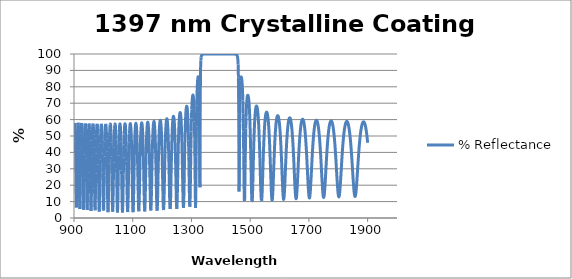
| Category | % Reflectance |
|---|---|
| 900.0 | 44.836 |
| 901.0 | 53.472 |
| 902.0 | 57.582 |
| 903.0 | 57.904 |
| 904.0 | 54.523 |
| 905.0 | 46.855 |
| 906.0 | 34.164 |
| 907.0 | 17.925 |
| 908.0 | 6.381 |
| 909.0 | 10.008 |
| 910.0 | 25.01 |
| 911.0 | 40.083 |
| 912.0 | 50.481 |
| 913.0 | 56.205 |
| 914.0 | 58.077 |
| 915.0 | 56.466 |
| 916.0 | 51.097 |
| 917.0 | 41.22 |
| 918.0 | 26.678 |
| 919.0 | 11.303 |
| 920.0 | 5.435 |
| 921.0 | 14.273 |
| 922.0 | 29.58 |
| 923.0 | 42.885 |
| 924.0 | 51.741 |
| 925.0 | 56.535 |
| 926.0 | 57.948 |
| 927.0 | 56.238 |
| 928.0 | 51.14 |
| 929.0 | 42.007 |
| 930.0 | 28.588 |
| 931.0 | 13.521 |
| 932.0 | 5.052 |
| 933.0 | 10.369 |
| 934.0 | 24.644 |
| 935.0 | 38.788 |
| 936.0 | 48.954 |
| 937.0 | 55.009 |
| 938.0 | 57.631 |
| 939.0 | 57.242 |
| 940.0 | 53.799 |
| 941.0 | 46.987 |
| 942.0 | 36.211 |
| 943.0 | 22.03 |
| 944.0 | 8.794 |
| 945.0 | 4.888 |
| 946.0 | 13.552 |
| 947.0 | 27.928 |
| 948.0 | 40.84 |
| 949.0 | 49.906 |
| 950.0 | 55.282 |
| 951.0 | 57.571 |
| 952.0 | 57.115 |
| 953.0 | 53.864 |
| 954.0 | 47.401 |
| 955.0 | 37.189 |
| 956.0 | 23.568 |
| 957.0 | 10.062 |
| 958.0 | 4.292 |
| 959.0 | 10.787 |
| 960.0 | 24.395 |
| 961.0 | 37.564 |
| 962.0 | 47.397 |
| 963.0 | 53.67 |
| 964.0 | 56.911 |
| 965.0 | 57.539 |
| 966.0 | 55.654 |
| 967.0 | 51.025 |
| 968.0 | 43.169 |
| 969.0 | 31.785 |
| 970.0 | 18.048 |
| 971.0 | 6.677 |
| 972.0 | 4.68 |
| 973.0 | 13.533 |
| 974.0 | 27.092 |
| 975.0 | 39.431 |
| 976.0 | 48.432 |
| 977.0 | 54.115 |
| 978.0 | 56.985 |
| 979.0 | 57.403 |
| 980.0 | 55.437 |
| 981.0 | 50.925 |
| 982.0 | 43.424 |
| 983.0 | 32.643 |
| 984.0 | 19.477 |
| 985.0 | 7.773 |
| 986.0 | 3.892 |
| 987.0 | 10.548 |
| 988.0 | 23.168 |
| 989.0 | 35.774 |
| 990.0 | 45.568 |
| 991.0 | 52.173 |
| 992.0 | 55.991 |
| 993.0 | 57.428 |
| 994.0 | 56.667 |
| 995.0 | 53.632 |
| 996.0 | 48.006 |
| 997.0 | 39.378 |
| 998.0 | 27.756 |
| 999.0 | 14.814 |
| 1000.0 | 5.239 |
| 1001.0 | 4.587 |
| 1002.0 | 13.137 |
| 1003.0 | 25.734 |
| 1004.0 | 37.508 |
| 1005.0 | 46.495 |
| 1006.0 | 52.55 |
| 1007.0 | 56.059 |
| 1008.0 | 57.376 |
| 1009.0 | 56.659 |
| 1010.0 | 53.84 |
| 1011.0 | 48.645 |
| 1012.0 | 40.7 |
| 1013.0 | 29.913 |
| 1014.0 | 17.422 |
| 1015.0 | 6.872 |
| 1016.0 | 3.569 |
| 1017.0 | 9.587 |
| 1018.0 | 21.205 |
| 1019.0 | 33.314 |
| 1020.0 | 43.187 |
| 1021.0 | 50.183 |
| 1022.0 | 54.641 |
| 1023.0 | 56.927 |
| 1024.0 | 57.276 |
| 1025.0 | 55.735 |
| 1026.0 | 52.161 |
| 1027.0 | 46.253 |
| 1028.0 | 37.701 |
| 1029.0 | 26.641 |
| 1030.0 | 14.612 |
| 1031.0 | 5.463 |
| 1032.0 | 3.825 |
| 1033.0 | 10.655 |
| 1034.0 | 22.109 |
| 1035.0 | 33.713 |
| 1036.0 | 43.177 |
| 1037.0 | 50.01 |
| 1038.0 | 54.439 |
| 1039.0 | 56.802 |
| 1040.0 | 57.33 |
| 1041.0 | 56.099 |
| 1042.0 | 53.013 |
| 1043.0 | 47.82 |
| 1044.0 | 40.223 |
| 1045.0 | 30.175 |
| 1046.0 | 18.576 |
| 1047.0 | 8.199 |
| 1048.0 | 3.358 |
| 1049.0 | 6.683 |
| 1050.0 | 16.272 |
| 1051.0 | 27.824 |
| 1052.0 | 38.21 |
| 1053.0 | 46.261 |
| 1054.0 | 51.914 |
| 1055.0 | 55.455 |
| 1056.0 | 57.168 |
| 1057.0 | 57.213 |
| 1058.0 | 55.602 |
| 1059.0 | 52.202 |
| 1060.0 | 46.765 |
| 1061.0 | 39.086 |
| 1062.0 | 29.162 |
| 1063.0 | 17.94 |
| 1064.0 | 8.046 |
| 1065.0 | 3.387 |
| 1066.0 | 6.341 |
| 1067.0 | 15.315 |
| 1068.0 | 26.446 |
| 1069.0 | 36.732 |
| 1070.0 | 44.921 |
| 1071.0 | 50.848 |
| 1072.0 | 54.747 |
| 1073.0 | 56.886 |
| 1074.0 | 57.447 |
| 1075.0 | 56.484 |
| 1076.0 | 53.926 |
| 1077.0 | 49.584 |
| 1078.0 | 43.207 |
| 1079.0 | 34.64 |
| 1080.0 | 24.225 |
| 1081.0 | 13.529 |
| 1082.0 | 5.528 |
| 1083.0 | 3.608 |
| 1084.0 | 8.708 |
| 1085.0 | 18.374 |
| 1086.0 | 29.118 |
| 1087.0 | 38.654 |
| 1088.0 | 46.146 |
| 1089.0 | 51.557 |
| 1090.0 | 55.117 |
| 1091.0 | 57.063 |
| 1092.0 | 57.551 |
| 1093.0 | 56.627 |
| 1094.0 | 54.225 |
| 1095.0 | 50.179 |
| 1096.0 | 44.262 |
| 1097.0 | 36.312 |
| 1098.0 | 26.527 |
| 1099.0 | 16.014 |
| 1100.0 | 7.266 |
| 1101.0 | 3.551 |
| 1102.0 | 6.122 |
| 1103.0 | 13.815 |
| 1104.0 | 23.772 |
| 1105.0 | 33.504 |
| 1106.0 | 41.73 |
| 1107.0 | 48.097 |
| 1108.0 | 52.688 |
| 1109.0 | 55.71 |
| 1110.0 | 57.351 |
| 1111.0 | 57.727 |
| 1112.0 | 56.871 |
| 1113.0 | 54.729 |
| 1114.0 | 51.169 |
| 1115.0 | 46.006 |
| 1116.0 | 39.076 |
| 1117.0 | 30.42 |
| 1118.0 | 20.632 |
| 1119.0 | 11.295 |
| 1120.0 | 4.983 |
| 1121.0 | 4.08 |
| 1122.0 | 8.96 |
| 1123.0 | 17.652 |
| 1124.0 | 27.472 |
| 1125.0 | 36.524 |
| 1126.0 | 43.975 |
| 1127.0 | 49.671 |
| 1128.0 | 53.742 |
| 1129.0 | 56.384 |
| 1130.0 | 57.757 |
| 1131.0 | 57.957 |
| 1132.0 | 57 |
| 1133.0 | 54.83 |
| 1134.0 | 51.32 |
| 1135.0 | 46.297 |
| 1136.0 | 39.609 |
| 1137.0 | 31.279 |
| 1138.0 | 21.811 |
| 1139.0 | 12.57 |
| 1140.0 | 5.86 |
| 1141.0 | 4.019 |
| 1142.0 | 7.785 |
| 1143.0 | 15.668 |
| 1144.0 | 25.176 |
| 1145.0 | 34.315 |
| 1146.0 | 42.078 |
| 1147.0 | 48.182 |
| 1148.0 | 52.695 |
| 1149.0 | 55.794 |
| 1150.0 | 57.645 |
| 1151.0 | 58.363 |
| 1152.0 | 58 |
| 1153.0 | 56.534 |
| 1154.0 | 53.882 |
| 1155.0 | 49.903 |
| 1156.0 | 44.431 |
| 1157.0 | 37.357 |
| 1158.0 | 28.81 |
| 1159.0 | 19.46 |
| 1160.0 | 10.844 |
| 1161.0 | 5.236 |
| 1162.0 | 4.608 |
| 1163.0 | 9.199 |
| 1164.0 | 17.325 |
| 1165.0 | 26.661 |
| 1166.0 | 35.475 |
| 1167.0 | 42.925 |
| 1168.0 | 48.796 |
| 1169.0 | 53.163 |
| 1170.0 | 56.194 |
| 1171.0 | 58.047 |
| 1172.0 | 58.831 |
| 1173.0 | 58.596 |
| 1174.0 | 57.331 |
| 1175.0 | 54.965 |
| 1176.0 | 51.373 |
| 1177.0 | 46.398 |
| 1178.0 | 39.909 |
| 1179.0 | 31.934 |
| 1180.0 | 22.909 |
| 1181.0 | 13.989 |
| 1182.0 | 7.141 |
| 1183.0 | 4.499 |
| 1184.0 | 7.045 |
| 1185.0 | 13.836 |
| 1186.0 | 22.748 |
| 1187.0 | 31.806 |
| 1188.0 | 39.841 |
| 1189.0 | 46.409 |
| 1190.0 | 51.477 |
| 1191.0 | 55.179 |
| 1192.0 | 57.677 |
| 1193.0 | 59.105 |
| 1194.0 | 59.547 |
| 1195.0 | 59.032 |
| 1196.0 | 57.531 |
| 1197.0 | 54.96 |
| 1198.0 | 51.19 |
| 1199.0 | 46.064 |
| 1200.0 | 39.463 |
| 1201.0 | 31.443 |
| 1202.0 | 22.475 |
| 1203.0 | 13.74 |
| 1204.0 | 7.179 |
| 1205.0 | 4.831 |
| 1206.0 | 7.56 |
| 1207.0 | 14.393 |
| 1208.0 | 23.261 |
| 1209.0 | 32.26 |
| 1210.0 | 40.262 |
| 1211.0 | 46.835 |
| 1212.0 | 51.945 |
| 1213.0 | 55.721 |
| 1214.0 | 58.325 |
| 1215.0 | 59.893 |
| 1216.0 | 60.513 |
| 1217.0 | 60.224 |
| 1218.0 | 59.007 |
| 1219.0 | 56.793 |
| 1220.0 | 53.463 |
| 1221.0 | 48.862 |
| 1222.0 | 42.841 |
| 1223.0 | 35.354 |
| 1224.0 | 26.659 |
| 1225.0 | 17.606 |
| 1226.0 | 9.85 |
| 1227.0 | 5.535 |
| 1228.0 | 6.187 |
| 1229.0 | 11.594 |
| 1230.0 | 19.973 |
| 1231.0 | 29.207 |
| 1232.0 | 37.812 |
| 1233.0 | 45.095 |
| 1234.0 | 50.894 |
| 1235.0 | 55.299 |
| 1236.0 | 58.474 |
| 1237.0 | 60.577 |
| 1238.0 | 61.724 |
| 1239.0 | 61.982 |
| 1240.0 | 61.364 |
| 1241.0 | 59.831 |
| 1242.0 | 57.289 |
| 1243.0 | 53.595 |
| 1244.0 | 48.574 |
| 1245.0 | 42.068 |
| 1246.0 | 34.061 |
| 1247.0 | 24.925 |
| 1248.0 | 15.752 |
| 1249.0 | 8.518 |
| 1250.0 | 5.505 |
| 1251.0 | 7.909 |
| 1252.0 | 14.877 |
| 1253.0 | 24.187 |
| 1254.0 | 33.712 |
| 1255.0 | 42.187 |
| 1256.0 | 49.143 |
| 1257.0 | 54.562 |
| 1258.0 | 58.603 |
| 1259.0 | 61.457 |
| 1260.0 | 63.285 |
| 1261.0 | 64.196 |
| 1262.0 | 64.244 |
| 1263.0 | 63.424 |
| 1264.0 | 61.677 |
| 1265.0 | 58.877 |
| 1266.0 | 54.843 |
| 1267.0 | 49.349 |
| 1268.0 | 42.19 |
| 1269.0 | 33.355 |
| 1270.0 | 23.366 |
| 1271.0 | 13.755 |
| 1272.0 | 7.156 |
| 1273.0 | 6.187 |
| 1274.0 | 11.425 |
| 1275.0 | 20.848 |
| 1276.0 | 31.539 |
| 1277.0 | 41.426 |
| 1278.0 | 49.629 |
| 1279.0 | 56.023 |
| 1280.0 | 60.8 |
| 1281.0 | 64.218 |
| 1282.0 | 66.499 |
| 1283.0 | 67.803 |
| 1284.0 | 68.216 |
| 1285.0 | 67.755 |
| 1286.0 | 66.365 |
| 1287.0 | 63.908 |
| 1288.0 | 60.155 |
| 1289.0 | 54.778 |
| 1290.0 | 47.391 |
| 1291.0 | 37.72 |
| 1292.0 | 26.111 |
| 1293.0 | 14.472 |
| 1294.0 | 6.875 |
| 1295.0 | 7.52 |
| 1296.0 | 16.494 |
| 1297.0 | 29.532 |
| 1298.0 | 42.297 |
| 1299.0 | 52.768 |
| 1300.0 | 60.657 |
| 1301.0 | 66.342 |
| 1302.0 | 70.296 |
| 1303.0 | 72.902 |
| 1304.0 | 74.412 |
| 1305.0 | 74.963 |
| 1306.0 | 74.573 |
| 1307.0 | 73.143 |
| 1308.0 | 70.414 |
| 1309.0 | 65.907 |
| 1310.0 | 58.818 |
| 1311.0 | 48.001 |
| 1312.0 | 32.588 |
| 1313.0 | 15.017 |
| 1314.0 | 6.113 |
| 1315.0 | 16.469 |
| 1316.0 | 37.478 |
| 1317.0 | 55.926 |
| 1318.0 | 68.421 |
| 1319.0 | 76.275 |
| 1320.0 | 81.125 |
| 1321.0 | 84.047 |
| 1322.0 | 85.633 |
| 1323.0 | 86.134 |
| 1324.0 | 85.5 |
| 1325.0 | 83.238 |
| 1326.0 | 77.79 |
| 1327.0 | 64.145 |
| 1328.0 | 27.907 |
| 1329.0 | 18.684 |
| 1330.0 | 73.166 |
| 1331.0 | 90.809 |
| 1332.0 | 96.064 |
| 1333.0 | 98.035 |
| 1334.0 | 98.911 |
| 1335.0 | 99.351 |
| 1336.0 | 99.591 |
| 1337.0 | 99.73 |
| 1338.0 | 99.816 |
| 1339.0 | 99.871 |
| 1340.0 | 99.907 |
| 1341.0 | 99.932 |
| 1342.0 | 99.949 |
| 1343.0 | 99.961 |
| 1344.0 | 99.97 |
| 1345.0 | 99.976 |
| 1346.0 | 99.981 |
| 1347.0 | 99.985 |
| 1348.0 | 99.988 |
| 1349.0 | 99.99 |
| 1350.0 | 99.992 |
| 1351.0 | 99.993 |
| 1352.0 | 99.994 |
| 1353.0 | 99.995 |
| 1354.0 | 99.996 |
| 1355.0 | 99.996 |
| 1356.0 | 99.997 |
| 1357.0 | 99.997 |
| 1358.0 | 99.998 |
| 1359.0 | 99.998 |
| 1360.0 | 99.998 |
| 1361.0 | 99.998 |
| 1362.0 | 99.998 |
| 1363.0 | 99.999 |
| 1364.0 | 99.999 |
| 1365.0 | 99.999 |
| 1366.0 | 99.999 |
| 1367.0 | 99.999 |
| 1368.0 | 99.999 |
| 1369.0 | 99.999 |
| 1370.0 | 99.999 |
| 1371.0 | 99.999 |
| 1372.0 | 99.999 |
| 1373.0 | 99.999 |
| 1374.0 | 99.999 |
| 1375.0 | 99.999 |
| 1376.0 | 99.999 |
| 1377.0 | 99.999 |
| 1378.0 | 100 |
| 1379.0 | 100 |
| 1380.0 | 100 |
| 1381.0 | 100 |
| 1382.0 | 100 |
| 1383.0 | 100 |
| 1384.0 | 100 |
| 1385.0 | 100 |
| 1386.0 | 100 |
| 1387.0 | 100 |
| 1388.0 | 100 |
| 1389.0 | 100 |
| 1390.0 | 100 |
| 1391.0 | 100 |
| 1392.0 | 100 |
| 1393.0 | 100 |
| 1394.0 | 100 |
| 1395.0 | 100 |
| 1396.0 | 100 |
| 1397.0 | 100 |
| 1398.0 | 100 |
| 1399.0 | 100 |
| 1400.0 | 100 |
| 1401.0 | 100 |
| 1402.0 | 100 |
| 1403.0 | 100 |
| 1404.0 | 100 |
| 1405.0 | 100 |
| 1406.0 | 100 |
| 1407.0 | 100 |
| 1408.0 | 99.999 |
| 1409.0 | 99.999 |
| 1410.0 | 99.999 |
| 1411.0 | 99.999 |
| 1412.0 | 99.999 |
| 1413.0 | 99.999 |
| 1414.0 | 99.999 |
| 1415.0 | 99.999 |
| 1416.0 | 99.999 |
| 1417.0 | 99.999 |
| 1418.0 | 99.999 |
| 1419.0 | 99.999 |
| 1420.0 | 99.999 |
| 1421.0 | 99.999 |
| 1422.0 | 99.999 |
| 1423.0 | 99.999 |
| 1424.0 | 99.998 |
| 1425.0 | 99.998 |
| 1426.0 | 99.998 |
| 1427.0 | 99.998 |
| 1428.0 | 99.998 |
| 1429.0 | 99.997 |
| 1430.0 | 99.997 |
| 1431.0 | 99.997 |
| 1432.0 | 99.996 |
| 1433.0 | 99.996 |
| 1434.0 | 99.995 |
| 1435.0 | 99.994 |
| 1436.0 | 99.993 |
| 1437.0 | 99.992 |
| 1438.0 | 99.991 |
| 1439.0 | 99.989 |
| 1440.0 | 99.987 |
| 1441.0 | 99.984 |
| 1442.0 | 99.98 |
| 1443.0 | 99.976 |
| 1444.0 | 99.971 |
| 1445.0 | 99.963 |
| 1446.0 | 99.954 |
| 1447.0 | 99.941 |
| 1448.0 | 99.924 |
| 1449.0 | 99.901 |
| 1450.0 | 99.869 |
| 1451.0 | 99.824 |
| 1452.0 | 99.757 |
| 1453.0 | 99.658 |
| 1454.0 | 99.505 |
| 1455.0 | 99.26 |
| 1456.0 | 98.847 |
| 1457.0 | 98.109 |
| 1458.0 | 96.677 |
| 1459.0 | 93.585 |
| 1460.0 | 85.872 |
| 1461.0 | 63.655 |
| 1462.0 | 16.167 |
| 1463.0 | 24.617 |
| 1464.0 | 57.624 |
| 1465.0 | 73.208 |
| 1466.0 | 80.281 |
| 1467.0 | 83.74 |
| 1468.0 | 85.412 |
| 1469.0 | 86.022 |
| 1470.0 | 85.859 |
| 1471.0 | 85.007 |
| 1472.0 | 83.413 |
| 1473.0 | 80.906 |
| 1474.0 | 77.17 |
| 1475.0 | 71.707 |
| 1476.0 | 63.801 |
| 1477.0 | 52.646 |
| 1478.0 | 38.012 |
| 1479.0 | 22.011 |
| 1480.0 | 10.724 |
| 1481.0 | 10.418 |
| 1482.0 | 20.052 |
| 1483.0 | 33.202 |
| 1484.0 | 45.184 |
| 1485.0 | 54.551 |
| 1486.0 | 61.439 |
| 1487.0 | 66.375 |
| 1488.0 | 69.851 |
| 1489.0 | 72.233 |
| 1490.0 | 73.769 |
| 1491.0 | 74.621 |
| 1492.0 | 74.884 |
| 1493.0 | 74.604 |
| 1494.0 | 73.787 |
| 1495.0 | 72.4 |
| 1496.0 | 70.378 |
| 1497.0 | 67.619 |
| 1498.0 | 63.982 |
| 1499.0 | 59.3 |
| 1500.0 | 53.401 |
| 1501.0 | 46.552 |
| 1502.0 | 38.556 |
| 1503.0 | 29.798 |
| 1504.0 | 21.168 |
| 1505.0 | 14.088 |
| 1506.0 | 10.129 |
| 1507.0 | 10.253 |
| 1508.0 | 14.233 |
| 1509.0 | 20.838 |
| 1510.0 | 28.564 |
| 1511.0 | 36.236 |
| 1512.0 | 43.184 |
| 1513.0 | 49.139 |
| 1514.0 | 54.073 |
| 1515.0 | 58.066 |
| 1516.0 | 61.236 |
| 1517.0 | 63.7 |
| 1518.0 | 65.559 |
| 1519.0 | 66.892 |
| 1520.0 | 67.759 |
| 1521.0 | 68.203 |
| 1522.0 | 68.248 |
| 1523.0 | 67.903 |
| 1524.0 | 67.165 |
| 1525.0 | 66.016 |
| 1526.0 | 64.424 |
| 1527.0 | 62.347 |
| 1528.0 | 59.73 |
| 1529.0 | 56.513 |
| 1530.0 | 52.634 |
| 1531.0 | 48.046 |
| 1532.0 | 42.742 |
| 1533.0 | 36.794 |
| 1534.0 | 30.405 |
| 1535.0 | 23.961 |
| 1536.0 | 18.05 |
| 1537.0 | 13.405 |
| 1538.0 | 10.726 |
| 1539.0 | 10.449 |
| 1540.0 | 12.569 |
| 1541.0 | 16.647 |
| 1542.0 | 22 |
| 1543.0 | 27.926 |
| 1544.0 | 33.86 |
| 1545.0 | 39.433 |
| 1546.0 | 44.444 |
| 1547.0 | 48.815 |
| 1548.0 | 52.542 |
| 1549.0 | 55.661 |
| 1550.0 | 58.225 |
| 1551.0 | 60.288 |
| 1552.0 | 61.901 |
| 1553.0 | 63.106 |
| 1554.0 | 63.938 |
| 1555.0 | 64.421 |
| 1556.0 | 64.571 |
| 1557.0 | 64.397 |
| 1558.0 | 63.898 |
| 1559.0 | 63.066 |
| 1560.0 | 61.885 |
| 1561.0 | 60.333 |
| 1562.0 | 58.38 |
| 1563.0 | 55.994 |
| 1564.0 | 53.14 |
| 1565.0 | 49.788 |
| 1566.0 | 45.918 |
| 1567.0 | 41.537 |
| 1568.0 | 36.698 |
| 1569.0 | 31.521 |
| 1570.0 | 26.217 |
| 1571.0 | 21.107 |
| 1572.0 | 16.602 |
| 1573.0 | 13.159 |
| 1574.0 | 11.184 |
| 1575.0 | 10.922 |
| 1576.0 | 12.385 |
| 1577.0 | 15.35 |
| 1578.0 | 19.43 |
| 1579.0 | 24.18 |
| 1580.0 | 29.191 |
| 1581.0 | 34.142 |
| 1582.0 | 38.816 |
| 1583.0 | 43.084 |
| 1584.0 | 46.887 |
| 1585.0 | 50.208 |
| 1586.0 | 53.061 |
| 1587.0 | 55.472 |
| 1588.0 | 57.473 |
| 1589.0 | 59.096 |
| 1590.0 | 60.37 |
| 1591.0 | 61.32 |
| 1592.0 | 61.967 |
| 1593.0 | 62.324 |
| 1594.0 | 62.401 |
| 1595.0 | 62.201 |
| 1596.0 | 61.724 |
| 1597.0 | 60.962 |
| 1598.0 | 59.904 |
| 1599.0 | 58.536 |
| 1600.0 | 56.837 |
| 1601.0 | 54.787 |
| 1602.0 | 52.362 |
| 1603.0 | 49.543 |
| 1604.0 | 46.316 |
| 1605.0 | 42.684 |
| 1606.0 | 38.671 |
| 1607.0 | 34.338 |
| 1608.0 | 29.798 |
| 1609.0 | 25.223 |
| 1610.0 | 20.852 |
| 1611.0 | 16.978 |
| 1612.0 | 13.921 |
| 1613.0 | 11.967 |
| 1614.0 | 11.315 |
| 1615.0 | 12.026 |
| 1616.0 | 14.007 |
| 1617.0 | 17.037 |
| 1618.0 | 20.823 |
| 1619.0 | 25.054 |
| 1620.0 | 29.452 |
| 1621.0 | 33.797 |
| 1622.0 | 37.933 |
| 1623.0 | 41.761 |
| 1624.0 | 45.228 |
| 1625.0 | 48.312 |
| 1626.0 | 51.014 |
| 1627.0 | 53.347 |
| 1628.0 | 55.331 |
| 1629.0 | 56.987 |
| 1630.0 | 58.337 |
| 1631.0 | 59.4 |
| 1632.0 | 60.193 |
| 1633.0 | 60.729 |
| 1634.0 | 61.018 |
| 1635.0 | 61.065 |
| 1636.0 | 60.873 |
| 1637.0 | 60.44 |
| 1638.0 | 59.761 |
| 1639.0 | 58.829 |
| 1640.0 | 57.633 |
| 1641.0 | 56.159 |
| 1642.0 | 54.391 |
| 1643.0 | 52.315 |
| 1644.0 | 49.915 |
| 1645.0 | 47.18 |
| 1646.0 | 44.109 |
| 1647.0 | 40.712 |
| 1648.0 | 37.02 |
| 1649.0 | 33.093 |
| 1650.0 | 29.027 |
| 1651.0 | 24.961 |
| 1652.0 | 21.08 |
| 1653.0 | 17.603 |
| 1654.0 | 14.766 |
| 1655.0 | 12.79 |
| 1656.0 | 11.841 |
| 1657.0 | 12.001 |
| 1658.0 | 13.246 |
| 1659.0 | 15.455 |
| 1660.0 | 18.435 |
| 1661.0 | 21.958 |
| 1662.0 | 25.796 |
| 1663.0 | 29.747 |
| 1664.0 | 33.65 |
| 1665.0 | 37.386 |
| 1666.0 | 40.876 |
| 1667.0 | 44.075 |
| 1668.0 | 46.96 |
| 1669.0 | 49.526 |
| 1670.0 | 51.779 |
| 1671.0 | 53.73 |
| 1672.0 | 55.395 |
| 1673.0 | 56.79 |
| 1674.0 | 57.93 |
| 1675.0 | 58.827 |
| 1676.0 | 59.495 |
| 1677.0 | 59.942 |
| 1678.0 | 60.175 |
| 1679.0 | 60.197 |
| 1680.0 | 60.011 |
| 1681.0 | 59.615 |
| 1682.0 | 59.005 |
| 1683.0 | 58.176 |
| 1684.0 | 57.119 |
| 1685.0 | 55.824 |
| 1686.0 | 54.281 |
| 1687.0 | 52.477 |
| 1688.0 | 50.401 |
| 1689.0 | 48.045 |
| 1690.0 | 45.404 |
| 1691.0 | 42.483 |
| 1692.0 | 39.296 |
| 1693.0 | 35.876 |
| 1694.0 | 32.279 |
| 1695.0 | 28.586 |
| 1696.0 | 24.911 |
| 1697.0 | 21.4 |
| 1698.0 | 18.222 |
| 1699.0 | 15.559 |
| 1700.0 | 13.585 |
| 1701.0 | 12.44 |
| 1702.0 | 12.209 |
| 1703.0 | 12.905 |
| 1704.0 | 14.468 |
| 1705.0 | 16.775 |
| 1706.0 | 19.663 |
| 1707.0 | 22.953 |
| 1708.0 | 26.472 |
| 1709.0 | 30.068 |
| 1710.0 | 33.619 |
| 1711.0 | 37.032 |
| 1712.0 | 40.244 |
| 1713.0 | 43.216 |
| 1714.0 | 45.926 |
| 1715.0 | 48.365 |
| 1716.0 | 50.537 |
| 1717.0 | 52.446 |
| 1718.0 | 54.105 |
| 1719.0 | 55.524 |
| 1720.0 | 56.715 |
| 1721.0 | 57.69 |
| 1722.0 | 58.458 |
| 1723.0 | 59.028 |
| 1724.0 | 59.407 |
| 1725.0 | 59.599 |
| 1726.0 | 59.608 |
| 1727.0 | 59.433 |
| 1728.0 | 59.075 |
| 1729.0 | 58.53 |
| 1730.0 | 57.794 |
| 1731.0 | 56.861 |
| 1732.0 | 55.723 |
| 1733.0 | 54.373 |
| 1734.0 | 52.801 |
| 1735.0 | 50.998 |
| 1736.0 | 48.957 |
| 1737.0 | 46.674 |
| 1738.0 | 44.148 |
| 1739.0 | 41.386 |
| 1740.0 | 38.405 |
| 1741.0 | 35.236 |
| 1742.0 | 31.926 |
| 1743.0 | 28.546 |
| 1744.0 | 25.186 |
| 1745.0 | 21.961 |
| 1746.0 | 19.003 |
| 1747.0 | 16.456 |
| 1748.0 | 14.46 |
| 1749.0 | 13.133 |
| 1750.0 | 12.561 |
| 1751.0 | 12.779 |
| 1752.0 | 13.767 |
| 1753.0 | 15.457 |
| 1754.0 | 17.737 |
| 1755.0 | 20.475 |
| 1756.0 | 23.529 |
| 1757.0 | 26.764 |
| 1758.0 | 30.062 |
| 1759.0 | 33.325 |
| 1760.0 | 36.478 |
| 1761.0 | 39.469 |
| 1762.0 | 42.261 |
| 1763.0 | 44.834 |
| 1764.0 | 47.178 |
| 1765.0 | 49.29 |
| 1766.0 | 51.175 |
| 1767.0 | 52.837 |
| 1768.0 | 54.287 |
| 1769.0 | 55.532 |
| 1770.0 | 56.583 |
| 1771.0 | 57.448 |
| 1772.0 | 58.133 |
| 1773.0 | 58.647 |
| 1774.0 | 58.993 |
| 1775.0 | 59.175 |
| 1776.0 | 59.197 |
| 1777.0 | 59.058 |
| 1778.0 | 58.758 |
| 1779.0 | 58.295 |
| 1780.0 | 57.666 |
| 1781.0 | 56.868 |
| 1782.0 | 55.893 |
| 1783.0 | 54.736 |
| 1784.0 | 53.39 |
| 1785.0 | 51.848 |
| 1786.0 | 50.104 |
| 1787.0 | 48.153 |
| 1788.0 | 45.992 |
| 1789.0 | 43.623 |
| 1790.0 | 41.053 |
| 1791.0 | 38.297 |
| 1792.0 | 35.381 |
| 1793.0 | 32.343 |
| 1794.0 | 29.238 |
| 1795.0 | 26.135 |
| 1796.0 | 23.123 |
| 1797.0 | 20.304 |
| 1798.0 | 17.789 |
| 1799.0 | 15.694 |
| 1800.0 | 14.121 |
| 1801.0 | 13.157 |
| 1802.0 | 12.854 |
| 1803.0 | 13.227 |
| 1804.0 | 14.251 |
| 1805.0 | 15.865 |
| 1806.0 | 17.979 |
| 1807.0 | 20.485 |
| 1808.0 | 23.272 |
| 1809.0 | 26.23 |
| 1810.0 | 29.262 |
| 1811.0 | 32.287 |
| 1812.0 | 35.239 |
| 1813.0 | 38.068 |
| 1814.0 | 40.741 |
| 1815.0 | 43.233 |
| 1816.0 | 45.533 |
| 1817.0 | 47.634 |
| 1818.0 | 49.536 |
| 1819.0 | 51.242 |
| 1820.0 | 52.758 |
| 1821.0 | 54.089 |
| 1822.0 | 55.243 |
| 1823.0 | 56.228 |
| 1824.0 | 57.049 |
| 1825.0 | 57.714 |
| 1826.0 | 58.226 |
| 1827.0 | 58.592 |
| 1828.0 | 58.813 |
| 1829.0 | 58.893 |
| 1830.0 | 58.831 |
| 1831.0 | 58.629 |
| 1832.0 | 58.286 |
| 1833.0 | 57.799 |
| 1834.0 | 57.165 |
| 1835.0 | 56.381 |
| 1836.0 | 55.443 |
| 1837.0 | 54.345 |
| 1838.0 | 53.081 |
| 1839.0 | 51.647 |
| 1840.0 | 50.038 |
| 1841.0 | 48.25 |
| 1842.0 | 46.28 |
| 1843.0 | 44.13 |
| 1844.0 | 41.804 |
| 1845.0 | 39.313 |
| 1846.0 | 36.676 |
| 1847.0 | 33.918 |
| 1848.0 | 31.077 |
| 1849.0 | 28.202 |
| 1850.0 | 25.356 |
| 1851.0 | 22.614 |
| 1852.0 | 20.06 |
| 1853.0 | 17.783 |
| 1854.0 | 15.876 |
| 1855.0 | 14.422 |
| 1856.0 | 13.488 |
| 1857.0 | 13.119 |
| 1858.0 | 13.331 |
| 1859.0 | 14.112 |
| 1860.0 | 15.419 |
| 1861.0 | 17.189 |
| 1862.0 | 19.339 |
| 1863.0 | 21.781 |
| 1864.0 | 24.426 |
| 1865.0 | 27.188 |
| 1866.0 | 29.994 |
| 1867.0 | 32.781 |
| 1868.0 | 35.498 |
| 1869.0 | 38.108 |
| 1870.0 | 40.583 |
| 1871.0 | 42.903 |
| 1872.0 | 45.058 |
| 1873.0 | 47.043 |
| 1874.0 | 48.855 |
| 1875.0 | 50.496 |
| 1876.0 | 51.971 |
| 1877.0 | 53.282 |
| 1878.0 | 54.438 |
| 1879.0 | 55.442 |
| 1880.0 | 56.3 |
| 1881.0 | 57.018 |
| 1882.0 | 57.601 |
| 1883.0 | 58.052 |
| 1884.0 | 58.374 |
| 1885.0 | 58.571 |
| 1886.0 | 58.643 |
| 1887.0 | 58.592 |
| 1888.0 | 58.419 |
| 1889.0 | 58.121 |
| 1890.0 | 57.698 |
| 1891.0 | 57.148 |
| 1892.0 | 56.468 |
| 1893.0 | 55.654 |
| 1894.0 | 54.703 |
| 1895.0 | 53.61 |
| 1896.0 | 52.372 |
| 1897.0 | 50.984 |
| 1898.0 | 49.442 |
| 1899.0 | 47.745 |
| 1900.0 | 45.89 |